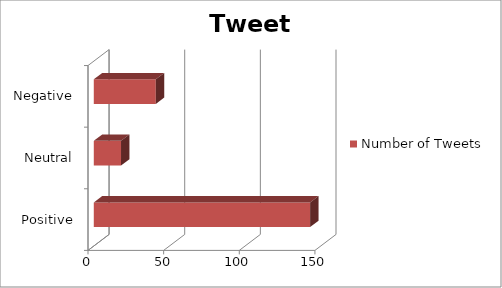
| Category | Number of Tweets |
|---|---|
| Positive | 143 |
| Neutral | 18 |
| Negative | 41 |